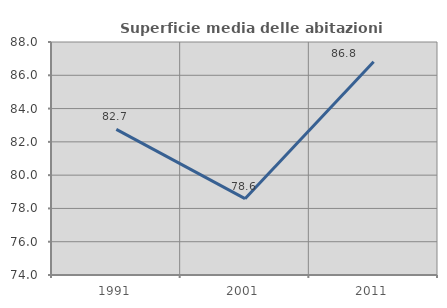
| Category | Superficie media delle abitazioni occupate |
|---|---|
| 1991.0 | 82.747 |
| 2001.0 | 78.586 |
| 2011.0 | 86.811 |